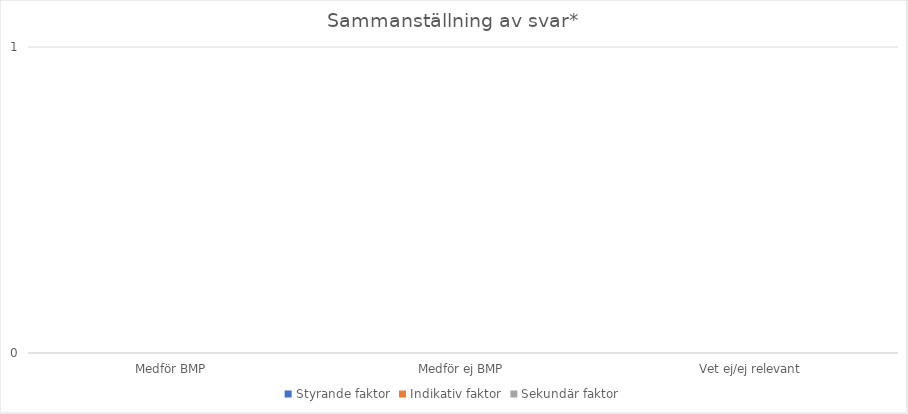
| Category | Styrande faktor | Indikativ faktor | Sekundär faktor |
|---|---|---|---|
| Medför BMP | 0 | 0 | 0 |
| Medför ej BMP | 0 | 0 | 0 |
| Vet ej/ej relevant | 0 | 0 | 0 |